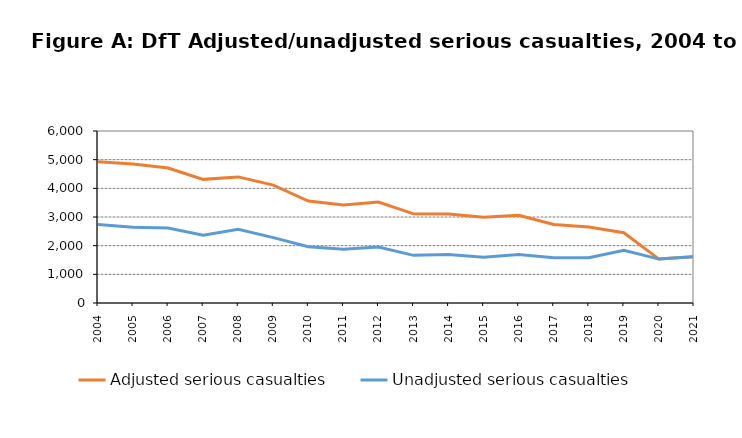
| Category | Adjusted serious casualties | Unadjusted serious casualties |
|---|---|---|
| 2004.0 | 4931 | 2741 |
| 2005.0 | 4849 | 2643 |
| 2006.0 | 4707 | 2614 |
| 2007.0 | 4313 | 2364 |
| 2008.0 | 4399 | 2571 |
| 2009.0 | 4112 | 2281 |
| 2010.0 | 3558 | 1964 |
| 2011.0 | 3416 | 1871 |
| 2012.0 | 3521 | 1956 |
| 2013.0 | 3109 | 1662 |
| 2014.0 | 3103 | 1691 |
| 2015.0 | 2992 | 1597 |
| 2016.0 | 3057 | 1693 |
| 2017.0 | 2741 | 1577 |
| 2018.0 | 2649 | 1580 |
| 2019.0 | 2450 | 1842 |
| 2020.0 | 1532 | 1532 |
| 2021.0 | 1615 | 1615 |